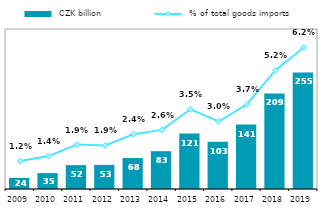
| Category |  CZK billion |
|---|---|
| 2009.0 | 24.276 |
| 2010.0 | 34.751 |
| 2011.0 | 52.182 |
| 2012.0 | 52.758 |
| 2013.0 | 67.707 |
| 2014.0 | 82.719 |
| 2015.0 | 121.222 |
| 2016.0 | 103.219 |
| 2017.0 | 141.049 |
| 2018.0 | 209.053 |
| 2019.0 | 255.061 |